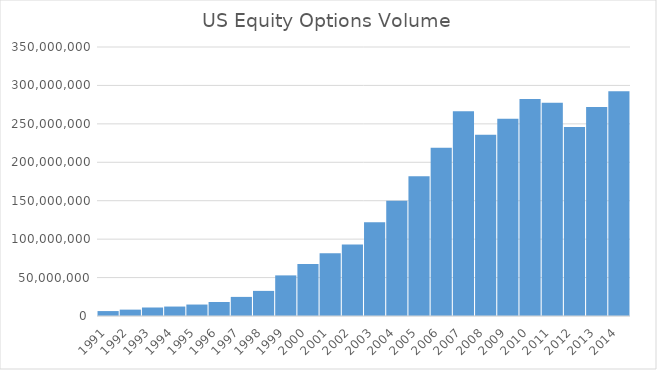
| Category | Series 0 |
|---|---|
| 1991.0 | 6415025 |
| 1992.0 | 8281401 |
| 1993.0 | 11060293 |
| 1994.0 | 12292826 |
| 1995.0 | 14911275 |
| 1996.0 | 18226729 |
| 1997.0 | 24853067 |
| 1998.0 | 32670928 |
| 1999.0 | 52835522 |
| 2000.0 | 67635806 |
| 2001.0 | 81597318 |
| 2002.0 | 93122926 |
| 2003.0 | 121897374 |
| 2004.0 | 149841144 |
| 2005.0 | 181692388 |
| 2006.0 | 218804688 |
| 2007.0 | 266246756 |
| 2008.0 | 235799395 |
| 2009.0 | 256722514 |
| 2010.0 | 282283772 |
| 2011.0 | 277388519 |
| 2012.0 | 245799475 |
| 2013.0 | 272040549 |
| 2014.0 | 292366664 |